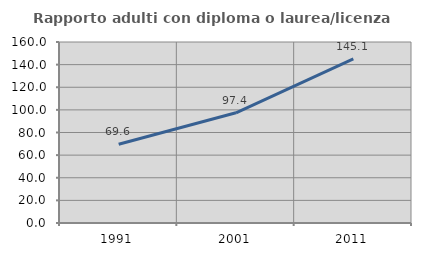
| Category | Rapporto adulti con diploma o laurea/licenza media  |
|---|---|
| 1991.0 | 69.577 |
| 2001.0 | 97.403 |
| 2011.0 | 145.099 |